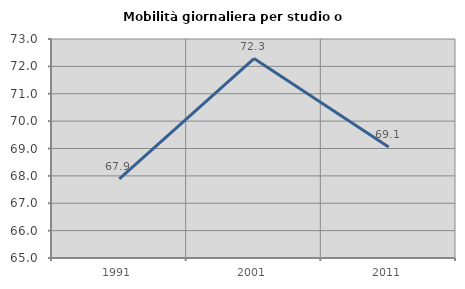
| Category | Mobilità giornaliera per studio o lavoro |
|---|---|
| 1991.0 | 67.891 |
| 2001.0 | 72.285 |
| 2011.0 | 69.057 |